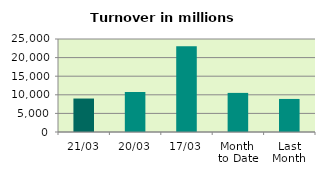
| Category | Series 0 |
|---|---|
| 21/03 | 8996.242 |
| 20/03 | 10749.062 |
| 17/03 | 23078.391 |
| Month 
to Date | 10511.297 |
| Last
Month | 8884.685 |